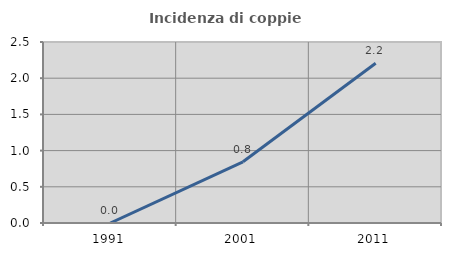
| Category | Incidenza di coppie miste |
|---|---|
| 1991.0 | 0 |
| 2001.0 | 0.845 |
| 2011.0 | 2.206 |